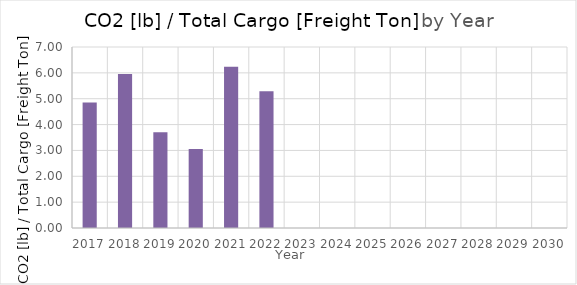
| Category | CO2 [lb] / Total Cargo [Freight Ton] |
|---|---|
| 2017.0 | 4.857 |
| 2018.0 | 5.96 |
| 2019.0 | 3.701 |
| 2020.0 | 3.055 |
| 2021.0 | 6.239 |
| 2022.0 | 5.293 |
| 2023.0 | 0 |
| 2024.0 | 0 |
| 2025.0 | 0 |
| 2026.0 | 0 |
| 2027.0 | 0 |
| 2028.0 | 0 |
| 2029.0 | 0 |
| 2030.0 | 0 |